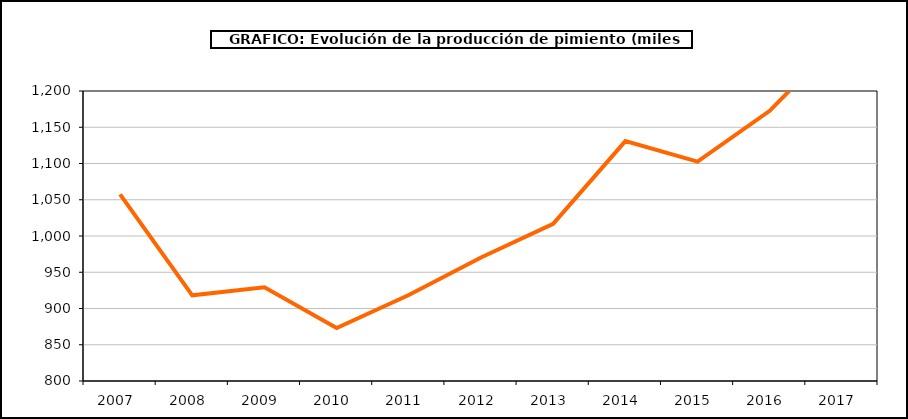
| Category | producción |
|---|---|
| 2007.0 | 1057.533 |
| 2008.0 | 918.14 |
| 2009.0 | 929.317 |
| 2010.0 | 873.011 |
| 2011.0 | 918.549 |
| 2012.0 | 970.296 |
| 2013.0 | 1016.811 |
| 2014.0 | 1130.863 |
| 2015.0 | 1102.522 |
| 2016.0 | 1172.639 |
| 2017.0 | 1274.264 |